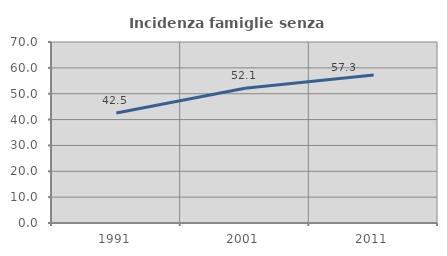
| Category | Incidenza famiglie senza nuclei |
|---|---|
| 1991.0 | 42.537 |
| 2001.0 | 52.137 |
| 2011.0 | 57.273 |